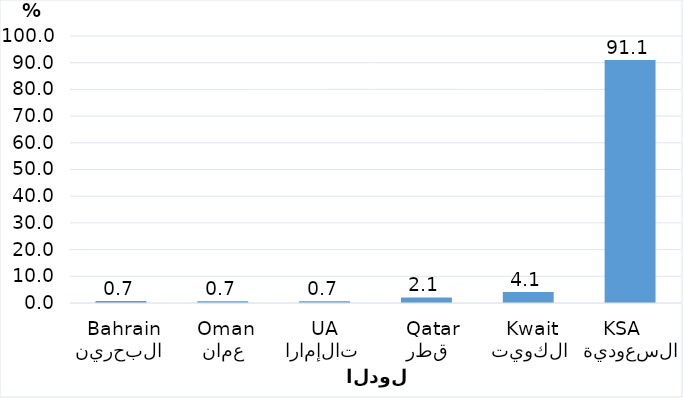
| Category | Series 0 |
|---|---|
| السعودية
  KSA      | 91.05 |
| الكويت
 Kwait | 4.129 |
| قطر
  Qatar | 2.107 |
| الإمارات 
UAE | 0.671 |
| عمان
 Oman | 0.671 |
| البحرين 
 Bahrain
 | 0.713 |